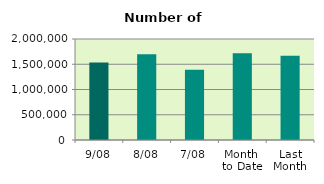
| Category | Series 0 |
|---|---|
| 9/08 | 1536620 |
| 8/08 | 1698342 |
| 7/08 | 1388992 |
| Month 
to Date | 1716968 |
| Last
Month | 1667155.905 |